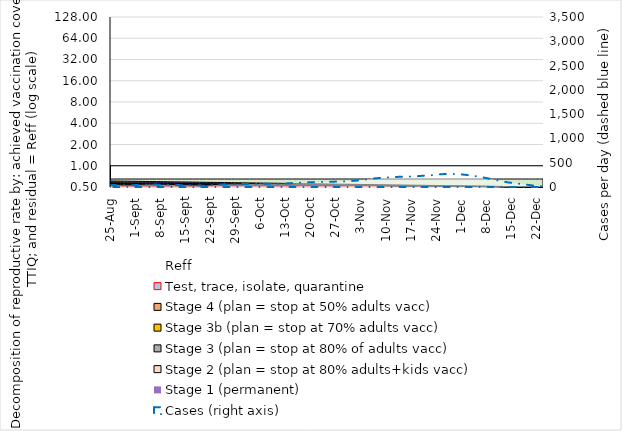
| Category | Reff | Test, trace, isolate, quarantine | Stage 4 (plan = stop at 50% adults vacc) | Stage 3b (plan = stop at 70% adults vacc) | Stage 3 (plan = stop at 80% of adults vacc) | Stage 2 (plan = stop at 80% adults+kids vacc) | Stage 1 (permanent) | Due to vaccination |
|---|---|---|---|---|---|---|---|---|
| 2021-08-25 | 0.946 | 0.763 | 0.92 | 0.464 | 0.589 | 0.65 | 0.705 | 1.461 |
| 2021-08-26 | 0.939 | 0.758 | 0.914 | 0.461 | 0.585 | 0.645 | 0.7 | 1.499 |
| 2021-08-27 | 0.931 | 0.753 | 0.907 | 0.457 | 0.581 | 0.64 | 0.695 | 1.536 |
| 2021-08-28 | 0.922 | 0.749 | 0.9 | 0.454 | 0.576 | 0.636 | 0.69 | 1.574 |
| 2021-08-29 | 0.913 | 0.745 | 0.893 | 0.45 | 0.572 | 0.631 | 0.684 | 1.611 |
| 2021-08-30 | 0.904 | 0.741 | 0.886 | 0.447 | 0.567 | 0.626 | 0.679 | 1.649 |
| 2021-08-31 | 0.895 | 0.738 | 0.879 | 0.443 | 0.563 | 0.621 | 0.674 | 1.686 |
| 2021-09-01 | 0.886 | 0.734 | 0.873 | 0.44 | 0.559 | 0.616 | 0.669 | 1.723 |
| 2021-09-02 | 0.89 | 0.717 | 0.866 | 0.436 | 0.554 | 0.611 | 0.663 | 1.761 |
| 2021-09-03 | 0.894 | 0.701 | 0.859 | 0.433 | 0.55 | 0.607 | 0.658 | 1.798 |
| 2021-09-04 | 0.895 | 0.688 | 0.852 | 0.43 | 0.546 | 0.602 | 0.653 | 1.836 |
| 2021-09-05 | 0.892 | 0.677 | 0.845 | 0.426 | 0.541 | 0.597 | 0.648 | 1.873 |
| 2021-09-06 | 0.887 | 0.67 | 0.838 | 0.423 | 0.537 | 0.592 | 0.642 | 1.911 |
| 2021-09-07 | 0.879 | 0.665 | 0.831 | 0.419 | 0.532 | 0.587 | 0.637 | 1.948 |
| 2021-09-08 | 0.869 | 0.662 | 0.825 | 0.416 | 0.528 | 0.582 | 0.632 | 1.986 |
| 2021-09-09 | 0.859 | 0.66 | 0.818 | 0.412 | 0.524 | 0.578 | 0.627 | 2.023 |
| 2021-09-10 | 0.848 | 0.658 | 0.811 | 0.409 | 0.519 | 0.573 | 0.622 | 2.061 |
| 2021-09-11 | 0.837 | 0.656 | 0.804 | 0.405 | 0.515 | 0.568 | 0.616 | 2.098 |
| 2021-09-12 | 0.827 | 0.654 | 0.797 | 0.402 | 0.51 | 0.563 | 0.611 | 2.136 |
| 2021-09-13 | 0.816 | 0.652 | 0.79 | 0.399 | 0.506 | 0.558 | 0.606 | 2.173 |
| 2021-09-14 | 0.805 | 0.651 | 0.784 | 0.395 | 0.502 | 0.553 | 0.601 | 2.211 |
| 2021-09-15 | 0.794 | 0.649 | 0.777 | 0.392 | 0.497 | 0.549 | 0.595 | 2.248 |
| 2021-09-16 | 0.782 | 0.647 | 0.77 | 0.388 | 0.493 | 0.544 | 0.59 | 2.286 |
| 2021-09-17 | 0.771 | 0.646 | 0.763 | 0.385 | 0.489 | 0.539 | 0.585 | 2.323 |
| 2021-09-18 | 0.76 | 0.644 | 0.756 | 0.381 | 0.484 | 0.534 | 0.58 | 2.36 |
| 2021-09-19 | 0.749 | 0.643 | 0.749 | 0.378 | 0.48 | 0.529 | 0.574 | 2.398 |
| 2021-09-20 | 0.738 | 0.641 | 0.743 | 0.374 | 0.475 | 0.524 | 0.569 | 2.435 |
| 2021-09-21 | 1.119 | 0.983 | 0 | 0.371 | 0.471 | 0.52 | 0.564 | 2.473 |
| 2021-09-22 | 1.111 | 0.972 | 0 | 0.367 | 0.467 | 0.515 | 0.559 | 2.51 |
| 2021-09-23 | 1.12 | 0.943 | 0 | 0.364 | 0.462 | 0.51 | 0.553 | 2.548 |
| 2021-09-24 | 1.129 | 0.914 | 0 | 0.361 | 0.458 | 0.505 | 0.548 | 2.585 |
| 2021-09-25 | 1.135 | 0.889 | 0 | 0.357 | 0.453 | 0.5 | 0.543 | 2.623 |
| 2021-09-26 | 1.137 | 0.867 | 0 | 0.354 | 0.449 | 0.495 | 0.538 | 2.66 |
| 2021-09-27 | 1.136 | 0.848 | 0 | 0.35 | 0.445 | 0.491 | 0.532 | 2.698 |
| 2021-09-28 | 1.132 | 0.833 | 0 | 0.347 | 0.44 | 0.486 | 0.527 | 2.735 |
| 2021-09-29 | 1.125 | 0.82 | 0 | 0.343 | 0.436 | 0.481 | 0.522 | 2.773 |
| 2021-09-30 | 1.118 | 0.808 | 0 | 0.34 | 0.432 | 0.476 | 0.517 | 2.81 |
| 2021-10-01 | 1.11 | 0.796 | 0 | 0.336 | 0.427 | 0.471 | 0.511 | 2.848 |
| 2021-10-02 | 1.102 | 0.785 | 0 | 0.333 | 0.423 | 0.466 | 0.506 | 2.885 |
| 2021-10-03 | 1.094 | 0.773 | 0 | 0.33 | 0.418 | 0.462 | 0.501 | 2.922 |
| 2021-10-04 | 1.085 | 0.762 | 0 | 0.326 | 0.414 | 0.457 | 0.496 | 2.96 |
| 2021-10-05 | 1.077 | 0.752 | 0 | 0.323 | 0.41 | 0.452 | 0.49 | 2.997 |
| 2021-10-06 | 1.068 | 0.741 | 0 | 0.319 | 0.405 | 0.447 | 0.485 | 3.035 |
| 2021-10-07 | 1.058 | 0.731 | 0 | 0.316 | 0.401 | 0.442 | 0.48 | 3.072 |
| 2021-10-08 | 1.048 | 0.721 | 0 | 0.312 | 0.397 | 0.437 | 0.475 | 3.11 |
| 2021-10-09 | 1.038 | 0.711 | 0 | 0.309 | 0.392 | 0.433 | 0.469 | 3.147 |
| 2021-10-10 | 1.028 | 0.702 | 0 | 0.305 | 0.388 | 0.428 | 0.464 | 3.185 |
| 2021-10-11 | 1.017 | 0.693 | 0 | 0.302 | 0.383 | 0.423 | 0.459 | 3.222 |
| 2021-10-12 | 1.006 | 0.685 | 0 | 0.298 | 0.379 | 0.418 | 0.454 | 3.26 |
| 2021-10-13 | 0.995 | 0.677 | 0 | 0.295 | 0.375 | 0.413 | 0.448 | 3.297 |
| 2021-10-14 | 0.995 | 0.657 | 0 | 0.292 | 0.37 | 0.408 | 0.443 | 3.335 |
| 2021-10-15 | 0.994 | 0.638 | 0 | 0.288 | 0.366 | 0.404 | 0.438 | 3.372 |
| 2021-10-16 | 0.991 | 0.622 | 0 | 0.285 | 0.361 | 0.399 | 0.433 | 3.41 |
| 2021-10-17 | 1.159 | 0.716 | 0 | 0 | 0.357 | 0.394 | 0.427 | 3.447 |
| 2021-10-18 | 1.155 | 0.696 | 0 | 0 | 0.353 | 0.389 | 0.422 | 3.484 |
| 2021-10-19 | 1.149 | 0.679 | 0 | 0 | 0.348 | 0.384 | 0.417 | 3.522 |
| 2021-10-20 | 1.141 | 0.665 | 0 | 0 | 0.344 | 0.379 | 0.412 | 3.559 |
| 2021-10-21 | 1.132 | 0.651 | 0 | 0 | 0.34 | 0.375 | 0.406 | 3.597 |
| 2021-10-22 | 1.122 | 0.637 | 0 | 0 | 0.335 | 0.37 | 0.401 | 3.634 |
| 2021-10-23 | 1.112 | 0.624 | 0 | 0 | 0.331 | 0.365 | 0.396 | 3.672 |
| 2021-10-24 | 1.102 | 0.611 | 0 | 0 | 0.326 | 0.36 | 0.391 | 3.709 |
| 2021-10-25 | 1.091 | 0.599 | 0 | 0 | 0.322 | 0.355 | 0.385 | 3.747 |
| 2021-10-26 | 1.08 | 0.587 | 0 | 0 | 0.318 | 0.35 | 0.38 | 3.784 |
| 2021-10-27 | 1.069 | 0.576 | 0 | 0 | 0.313 | 0.346 | 0.375 | 3.822 |
| 2021-10-28 | 1.056 | 0.565 | 0 | 0 | 0.309 | 0.341 | 0.37 | 3.859 |
| 2021-10-29 | 1.044 | 0.555 | 0 | 0 | 0.304 | 0.336 | 0.364 | 3.897 |
| 2021-10-30 | 1.227 | 0.649 | 0 | 0 | 0 | 0.331 | 0.359 | 3.934 |
| 2021-10-31 | 1.218 | 0.63 | 0 | 0 | 0 | 0.326 | 0.354 | 3.972 |
| 2021-11-01 | 1.21 | 0.611 | 0 | 0 | 0 | 0.321 | 0.349 | 4.009 |
| 2021-11-02 | 1.201 | 0.593 | 0 | 0 | 0 | 0.317 | 0.343 | 4.046 |
| 2021-11-03 | 1.191 | 0.575 | 0 | 0 | 0 | 0.312 | 0.338 | 4.084 |
| 2021-11-04 | 1.19 | 0.549 | 0 | 0 | 0 | 0.307 | 0.333 | 4.121 |
| 2021-11-05 | 1.187 | 0.524 | 0 | 0 | 0 | 0.302 | 0.328 | 4.159 |
| 2021-11-06 | 1.182 | 0.502 | 0 | 0 | 0 | 0.297 | 0.323 | 4.196 |
| 2021-11-07 | 1.175 | 0.481 | 0 | 0 | 0 | 0.292 | 0.317 | 4.234 |
| 2021-11-08 | 1.166 | 0.463 | 0 | 0 | 0 | 0.288 | 0.312 | 4.271 |
| 2021-11-09 | 1.155 | 0.447 | 0 | 0 | 0 | 0.283 | 0.307 | 4.309 |
| 2021-11-10 | 1.142 | 0.433 | 0 | 0 | 0 | 0.278 | 0.302 | 4.346 |
| 2021-11-11 | 1.128 | 0.419 | 0 | 0 | 0 | 0.273 | 0.296 | 4.384 |
| 2021-11-12 | 1.113 | 0.406 | 0 | 0 | 0 | 0.268 | 0.291 | 4.421 |
| 2021-11-13 | 1.098 | 0.395 | 0 | 0 | 0 | 0.263 | 0.286 | 4.459 |
| 2021-11-14 | 1.082 | 0.383 | 0 | 0 | 0 | 0.259 | 0.281 | 4.496 |
| 2021-11-15 | 1.065 | 0.373 | 0 | 0 | 0 | 0.254 | 0.275 | 4.534 |
| 2021-11-16 | 1.047 | 0.363 | 0 | 0 | 0 | 0.249 | 0.27 | 4.571 |
| 2021-11-17 | 1.028 | 0.354 | 0 | 0 | 0 | 0.244 | 0.265 | 4.608 |
| 2021-11-18 | 1.009 | 0.346 | 0 | 0 | 0 | 0.239 | 0.26 | 4.646 |
| 2021-11-19 | 1.164 | 0.399 | 0 | 0 | 0 | 0 | 0.254 | 4.683 |
| 2021-11-20 | 1.146 | 0.384 | 0 | 0 | 0 | 0 | 0.249 | 4.721 |
| 2021-11-21 | 1.128 | 0.37 | 0 | 0 | 0 | 0 | 0.244 | 4.758 |
| 2021-11-22 | 1.109 | 0.357 | 0 | 0 | 0 | 0 | 0.239 | 4.796 |
| 2021-11-23 | 1.089 | 0.345 | 0 | 0 | 0 | 0 | 0.233 | 4.833 |
| 2021-11-24 | 1.068 | 0.334 | 0 | 0 | 0 | 0 | 0.228 | 4.871 |
| 2021-11-25 | 1.049 | 0.32 | 0 | 0 | 0 | 0 | 0.223 | 4.908 |
| 2021-11-26 | 1.03 | 0.307 | 0 | 0 | 0 | 0 | 0.218 | 4.946 |
| 2021-11-27 | 1.009 | 0.295 | 0 | 0 | 0 | 0 | 0.212 | 4.983 |
| 2021-11-28 | 0.986 | 0.286 | 0 | 0 | 0 | 0 | 0.207 | 5.021 |
| 2021-11-29 | 0.962 | 0.278 | 0 | 0 | 0 | 0 | 0.202 | 5.058 |
| 2021-11-30 | 0.937 | 0.271 | 0 | 0 | 0 | 0 | 0.197 | 5.096 |
| 2021-12-01 | 0.909 | 0.266 | 0 | 0 | 0 | 0 | 0.191 | 5.133 |
| 2021-12-02 | 0.882 | 0.262 | 0 | 0 | 0 | 0 | 0.186 | 5.17 |
| 2021-12-03 | 0.853 | 0.258 | 0 | 0 | 0 | 0 | 0.181 | 5.208 |
| 2021-12-04 | 0.823 | 0.256 | 0 | 0 | 0 | 0 | 0.176 | 5.245 |
| 2021-12-05 | 0.793 | 0.254 | 0 | 0 | 0 | 0 | 0.17 | 5.283 |
| 2021-12-06 | 0.762 | 0.253 | 0 | 0 | 0 | 0 | 0.165 | 5.32 |
| 2021-12-07 | 0.73 | 0.252 | 0 | 0 | 0 | 0 | 0.16 | 5.358 |
| 2021-12-08 | 0.697 | 0.253 | 0 | 0 | 0 | 0 | 0.155 | 5.395 |
| 2021-12-09 | 0.664 | 0.254 | 0 | 0 | 0 | 0 | 0.149 | 5.433 |
| 2021-12-10 | 0.63 | 0.255 | 0 | 0 | 0 | 0 | 0.144 | 5.47 |
| 2021-12-11 | 0.596 | 0.257 | 0 | 0 | 0 | 0 | 0.139 | 5.508 |
| 2021-12-12 | 0.562 | 0.26 | 0 | 0 | 0 | 0 | 0.134 | 5.545 |
| 2021-12-13 | 0.527 | 0.262 | 0 | 0 | 0 | 0 | 0.128 | 5.583 |
| 2021-12-14 | 0.493 | 0.264 | 0 | 0 | 0 | 0 | 0.123 | 5.62 |
| 2021-12-15 | 0.459 | 0.265 | 0 | 0 | 0 | 0 | 0.118 | 5.658 |
| 2021-12-16 | 0.431 | 0.261 | 0 | 0 | 0 | 0 | 0.113 | 5.695 |
| 2021-12-17 | 0.404 | 0.256 | 0 | 0 | 0 | 0 | 0.107 | 5.732 |
| 2021-12-18 | 0.376 | 0.252 | 0 | 0 | 0 | 0 | 0.102 | 5.77 |
| 2021-12-19 | 0.349 | 0.247 | 0 | 0 | 0 | 0 | 0.097 | 5.807 |
| 2021-12-20 | 0.322 | 0.242 | 0 | 0 | 0 | 0 | 0.092 | 5.845 |
| 2021-12-21 | 0.295 | 0.236 | 0 | 0 | 0 | 0 | 0.086 | 5.882 |
| 2021-12-22 | 0.27 | 0.229 | 0 | 0 | 0 | 0 | 0.081 | 5.92 |
| 2021-12-23 | 0.246 | 0.22 | 0 | 0 | 0 | 0 | 0.076 | 5.957 |
| 2021-12-24 | 0.225 | 0.21 | 0 | 0 | 0 | 0 | 0.071 | 5.995 |